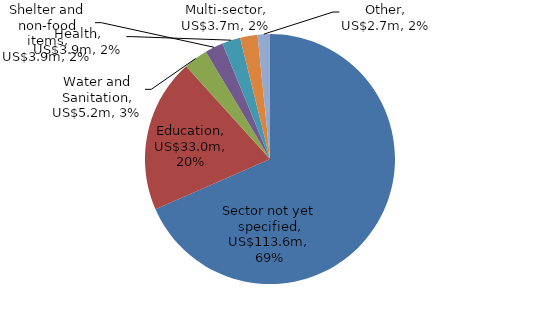
| Category | US$ millions |
|---|---|
| Sector not yet specified | 113.636 |
| Education | 32.99 |
| Water and Sanitation | 5.187 |
| Shelter and non-food items | 3.936 |
| Health | 3.921 |
| Multi-sector | 3.743 |
| Other | 2.651 |